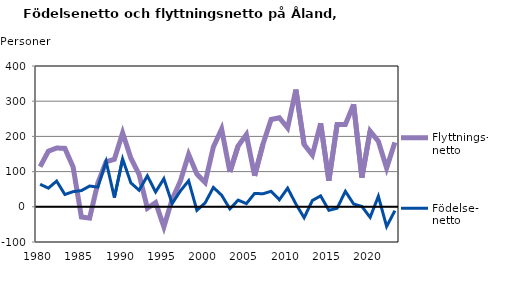
| Category | Flyttnings- netto | Födelse- netto |
|---|---|---|
| 1980.0 | 114 | 64 |
| 1981.0 | 158 | 53 |
| 1982.0 | 167 | 73 |
| 1983.0 | 166 | 35 |
| 1984.0 | 113 | 43 |
| 1985.0 | -29 | 46 |
| 1986.0 | -32 | 59 |
| 1987.0 | 68 | 56 |
| 1988.0 | 128 | 129 |
| 1989.0 | 135 | 26 |
| 1990.0 | 210 | 136 |
| 1991.0 | 138 | 68 |
| 1992.0 | 92 | 47 |
| 1993.0 | -4 | 88 |
| 1994.0 | 12 | 42 |
| 1995.0 | -57 | 80 |
| 1996.0 | 21 | 9 |
| 1997.0 | 73 | 45 |
| 1998.0 | 149 | 74 |
| 1999.0 | 93 | -10 |
| 2000.0 | 69 | 11 |
| 2001.0 | 170 | 55 |
| 2002.0 | 221 | 33 |
| 2003.0 | 99 | -6 |
| 2004.0 | 173 | 19 |
| 2005.0 | 205 | 9 |
| 2006.0 | 88 | 38 |
| 2007.0 | 177 | 37 |
| 2008.0 | 248 | 44 |
| 2009.0 | 253 | 20 |
| 2010.0 | 224 | 53 |
| 2011.0 | 333 | 8 |
| 2012.0 | 177 | -31 |
| 2013.0 | 147 | 18 |
| 2014.0 | 237 | 31 |
| 2015.0 | 74 | -10 |
| 2016.0 | 234 | -4 |
| 2017.0 | 234 | 44 |
| 2018.0 | 291 | 8 |
| 2019.0 | 83 | 1 |
| 2020.0 | 215 | -30 |
| 2021.0 | 186 | 30 |
| 2022.0 | 110 | -56 |
| 2023.0 | 183 | -11 |